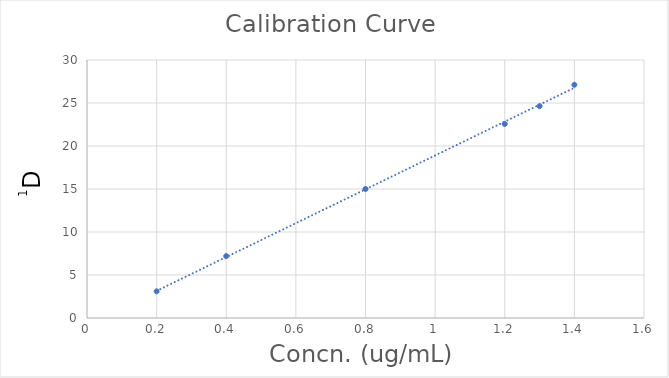
| Category | Series 0 |
|---|---|
| 0.2 | 3.1 |
| 0.4 | 7.2 |
| 0.8 | 15 |
| 1.2 | 22.56 |
| 1.3 | 24.63 |
| 1.4 | 27.12 |